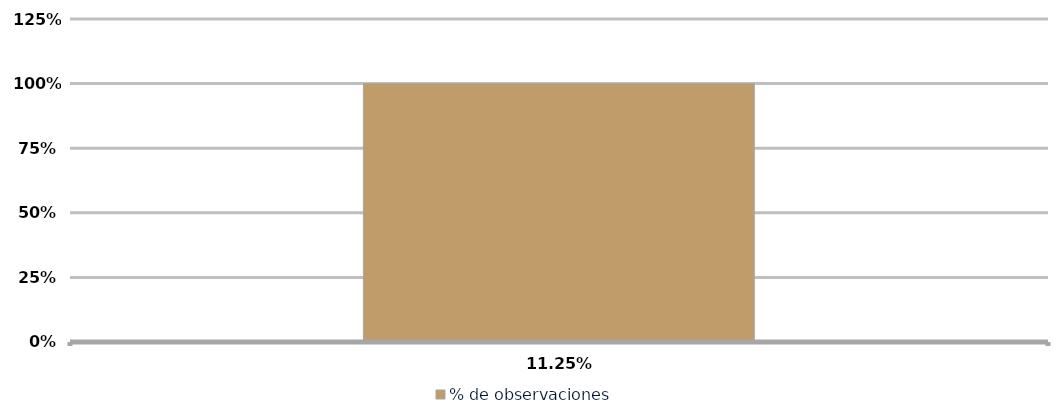
| Category | % de observaciones  |
|---|---|
| 0.1125 | 1 |